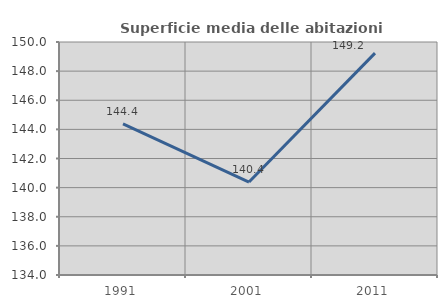
| Category | Superficie media delle abitazioni occupate |
|---|---|
| 1991.0 | 144.38 |
| 2001.0 | 140.385 |
| 2011.0 | 149.235 |